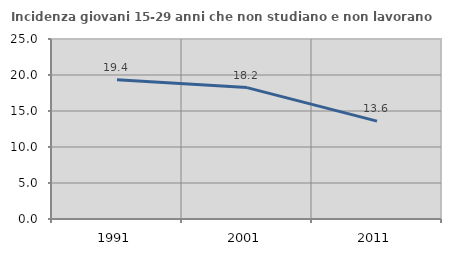
| Category | Incidenza giovani 15-29 anni che non studiano e non lavorano  |
|---|---|
| 1991.0 | 19.355 |
| 2001.0 | 18.247 |
| 2011.0 | 13.591 |